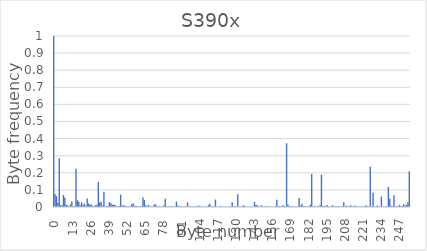
| Category | Series 0 |
|---|---|
| 0.0 | 1 |
| 1.0 | 0.076 |
| 2.0 | 0.064 |
| 3.0 | 0.025 |
| 4.0 | 0.285 |
| 5.0 | 0.011 |
| 6.0 | 0.009 |
| 7.0 | 0.07 |
| 8.0 | 0.055 |
| 9.0 | 0.013 |
| 10.0 | 0.009 |
| 11.0 | 0.006 |
| 12.0 | 0.015 |
| 13.0 | 0.033 |
| 14.0 | 0.005 |
| 15.0 | 0.005 |
| 16.0 | 0.224 |
| 17.0 | 0.039 |
| 18.0 | 0.03 |
| 19.0 | 0.011 |
| 20.0 | 0.027 |
| 21.0 | 0.01 |
| 22.0 | 0.02 |
| 23.0 | 0.008 |
| 24.0 | 0.049 |
| 25.0 | 0.021 |
| 26.0 | 0.013 |
| 27.0 | 0.014 |
| 28.0 | 0.006 |
| 29.0 | 0.004 |
| 30.0 | 0.01 |
| 31.0 | 0.014 |
| 32.0 | 0.146 |
| 33.0 | 0.027 |
| 34.0 | 0.03 |
| 35.0 | 0.008 |
| 36.0 | 0.089 |
| 37.0 | 0.004 |
| 38.0 | 0.005 |
| 39.0 | 0.006 |
| 40.0 | 0.029 |
| 41.0 | 0.023 |
| 42.0 | 0.012 |
| 43.0 | 0.015 |
| 44.0 | 0.012 |
| 45.0 | 0.003 |
| 46.0 | 0.007 |
| 47.0 | 0.006 |
| 48.0 | 0.072 |
| 49.0 | 0.009 |
| 50.0 | 0.009 |
| 51.0 | 0.009 |
| 52.0 | 0.005 |
| 53.0 | 0.003 |
| 54.0 | 0.004 |
| 55.0 | 0.004 |
| 56.0 | 0.016 |
| 57.0 | 0.023 |
| 58.0 | 0.007 |
| 59.0 | 0.008 |
| 60.0 | 0.006 |
| 61.0 | 0.003 |
| 62.0 | 0.004 |
| 63.0 | 0.006 |
| 64.0 | 0.056 |
| 65.0 | 0.04 |
| 66.0 | 0.01 |
| 67.0 | 0.006 |
| 68.0 | 0.011 |
| 69.0 | 0.003 |
| 70.0 | 0.003 |
| 71.0 | 0.004 |
| 72.0 | 0.014 |
| 73.0 | 0.016 |
| 74.0 | 0.005 |
| 75.0 | 0.005 |
| 76.0 | 0.004 |
| 77.0 | 0.002 |
| 78.0 | 0.003 |
| 79.0 | 0.01 |
| 80.0 | 0.048 |
| 81.0 | 0.004 |
| 82.0 | 0.005 |
| 83.0 | 0.003 |
| 84.0 | 0.005 |
| 85.0 | 0.005 |
| 86.0 | 0.003 |
| 87.0 | 0.003 |
| 88.0 | 0.031 |
| 89.0 | 0.009 |
| 90.0 | 0.004 |
| 91.0 | 0.003 |
| 92.0 | 0.003 |
| 93.0 | 0.003 |
| 94.0 | 0.003 |
| 95.0 | 0.002 |
| 96.0 | 0.027 |
| 97.0 | 0.003 |
| 98.0 | 0.004 |
| 99.0 | 0.002 |
| 100.0 | 0.003 |
| 101.0 | 0.002 |
| 102.0 | 0.004 |
| 103.0 | 0.002 |
| 104.0 | 0.009 |
| 105.0 | 0.005 |
| 106.0 | 0.003 |
| 107.0 | 0.003 |
| 108.0 | 0.002 |
| 109.0 | 0.002 |
| 110.0 | 0.002 |
| 111.0 | 0.011 |
| 112.0 | 0.019 |
| 113.0 | 0.003 |
| 114.0 | 0.004 |
| 115.0 | 0.002 |
| 116.0 | 0.044 |
| 117.0 | 0.002 |
| 118.0 | 0.002 |
| 119.0 | 0.003 |
| 120.0 | 0.005 |
| 121.0 | 0.002 |
| 122.0 | 0.002 |
| 123.0 | 0.002 |
| 124.0 | 0.002 |
| 125.0 | 0.002 |
| 126.0 | 0.002 |
| 127.0 | 0.004 |
| 128.0 | 0.028 |
| 129.0 | 0.004 |
| 130.0 | 0.005 |
| 131.0 | 0.002 |
| 132.0 | 0.074 |
| 133.0 | 0.002 |
| 134.0 | 0.002 |
| 135.0 | 0.002 |
| 136.0 | 0.011 |
| 137.0 | 0.006 |
| 138.0 | 0.003 |
| 139.0 | 0.002 |
| 140.0 | 0.002 |
| 141.0 | 0.002 |
| 142.0 | 0.003 |
| 143.0 | 0.003 |
| 144.0 | 0.031 |
| 145.0 | 0.012 |
| 146.0 | 0.011 |
| 147.0 | 0.003 |
| 148.0 | 0.003 |
| 149.0 | 0.01 |
| 150.0 | 0.003 |
| 151.0 | 0.002 |
| 152.0 | 0.005 |
| 153.0 | 0.005 |
| 154.0 | 0.002 |
| 155.0 | 0.003 |
| 156.0 | 0.002 |
| 157.0 | 0.002 |
| 158.0 | 0.002 |
| 159.0 | 0.004 |
| 160.0 | 0.043 |
| 161.0 | 0.004 |
| 162.0 | 0.006 |
| 163.0 | 0.003 |
| 164.0 | 0.008 |
| 165.0 | 0.009 |
| 166.0 | 0.002 |
| 167.0 | 0.373 |
| 168.0 | 0.015 |
| 169.0 | 0.003 |
| 170.0 | 0.005 |
| 171.0 | 0.003 |
| 172.0 | 0.003 |
| 173.0 | 0.002 |
| 174.0 | 0.002 |
| 175.0 | 0.005 |
| 176.0 | 0.053 |
| 177.0 | 0.009 |
| 178.0 | 0.019 |
| 179.0 | 0.005 |
| 180.0 | 0.004 |
| 181.0 | 0.002 |
| 182.0 | 0.002 |
| 183.0 | 0.002 |
| 184.0 | 0.013 |
| 185.0 | 0.194 |
| 186.0 | 0.004 |
| 187.0 | 0.007 |
| 188.0 | 0.003 |
| 189.0 | 0.004 |
| 190.0 | 0.002 |
| 191.0 | 0.011 |
| 192.0 | 0.189 |
| 193.0 | 0.005 |
| 194.0 | 0.008 |
| 195.0 | 0.004 |
| 196.0 | 0.012 |
| 197.0 | 0.002 |
| 198.0 | 0.002 |
| 199.0 | 0.002 |
| 200.0 | 0.011 |
| 201.0 | 0.003 |
| 202.0 | 0.003 |
| 203.0 | 0.003 |
| 204.0 | 0.006 |
| 205.0 | 0.002 |
| 206.0 | 0.003 |
| 207.0 | 0.004 |
| 208.0 | 0.027 |
| 209.0 | 0.003 |
| 210.0 | 0.009 |
| 211.0 | 0.002 |
| 212.0 | 0.003 |
| 213.0 | 0.01 |
| 214.0 | 0.002 |
| 215.0 | 0.003 |
| 216.0 | 0.009 |
| 217.0 | 0.002 |
| 218.0 | 0.002 |
| 219.0 | 0.003 |
| 220.0 | 0.003 |
| 221.0 | 0.002 |
| 222.0 | 0.002 |
| 223.0 | 0.003 |
| 224.0 | 0.01 |
| 225.0 | 0.005 |
| 226.0 | 0.002 |
| 227.0 | 0.235 |
| 228.0 | 0.003 |
| 229.0 | 0.084 |
| 230.0 | 0.002 |
| 231.0 | 0.003 |
| 232.0 | 0.009 |
| 233.0 | 0.003 |
| 234.0 | 0.003 |
| 235.0 | 0.062 |
| 236.0 | 0.003 |
| 237.0 | 0.003 |
| 238.0 | 0.003 |
| 239.0 | 0.005 |
| 240.0 | 0.117 |
| 241.0 | 0.048 |
| 242.0 | 0.007 |
| 243.0 | 0.004 |
| 244.0 | 0.068 |
| 245.0 | 0.004 |
| 246.0 | 0.004 |
| 247.0 | 0.005 |
| 248.0 | 0.012 |
| 249.0 | 0.006 |
| 250.0 | 0.006 |
| 251.0 | 0.016 |
| 252.0 | 0.009 |
| 253.0 | 0.012 |
| 254.0 | 0.028 |
| 255.0 | 0.208 |